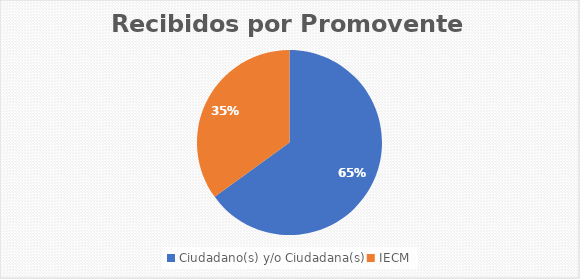
| Category | Series 0 |
|---|---|
| Ciudadano(s) y/o Ciudadana(s) | 13 |
| IECM | 7 |